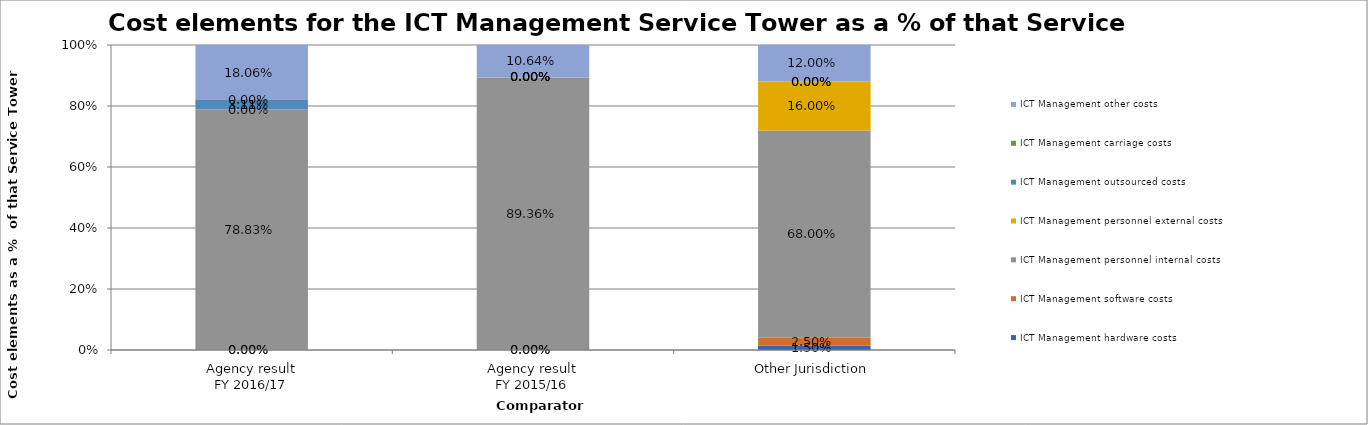
| Category | ICT Management hardware costs | ICT Management software costs | ICT Management personnel internal costs | ICT Management personnel external costs | ICT Management outsourced costs | ICT Management carriage costs | ICT Management other costs |
|---|---|---|---|---|---|---|---|
| Agency result
FY 2016/17 | 0 | 0 | 0.788 | 0 | 0.031 | 0 | 0.181 |
| Agency result
FY 2015/16 | 0 | 0 | 0.894 | 0 | 0 | 0 | 0.106 |
| Other Jurisdiction | 0.015 | 0.025 | 0.68 | 0.16 | 0 | 0 | 0.12 |